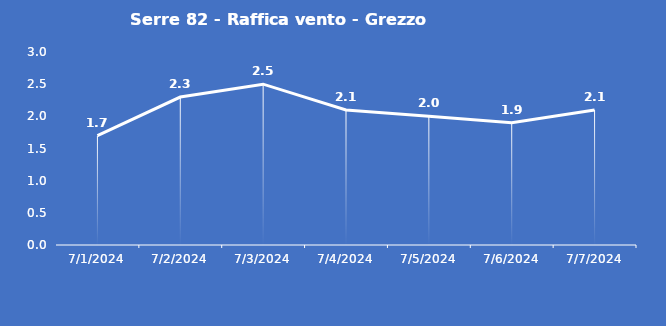
| Category | Serre 82 - Raffica vento - Grezzo (m/s) |
|---|---|
| 7/1/24 | 1.7 |
| 7/2/24 | 2.3 |
| 7/3/24 | 2.5 |
| 7/4/24 | 2.1 |
| 7/5/24 | 2 |
| 7/6/24 | 1.9 |
| 7/7/24 | 2.1 |